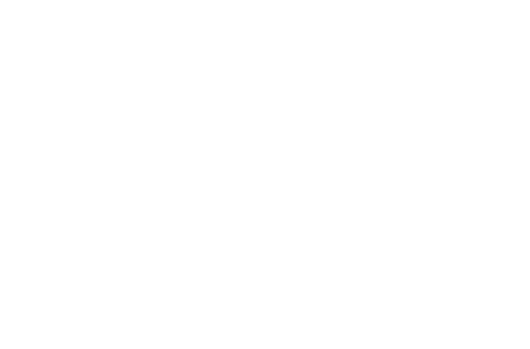
| Category | Betalt hovedstol | Betalte renter |
|---|---|---|
| 2019 | 316.351 | 226.28 |
| 2020 | 1105.769 | 739.178 |
| 2021 | 1939.715 | 1207.547 |
| 2022 | 2820.703 | 1628.874 |
| 2023 | 3751.386 | 2000.507 |
| 2024 | 4734.566 | 2319.642 |
| 2025 | 5773.206 | 2583.318 |
| 2026 | 6870.433 | 2788.406 |
| 2027 | 8029.552 | 2931.602 |
| 2028 | 9254.054 | 3009.415 |
| 2029 | 10000 | 3023.153 |